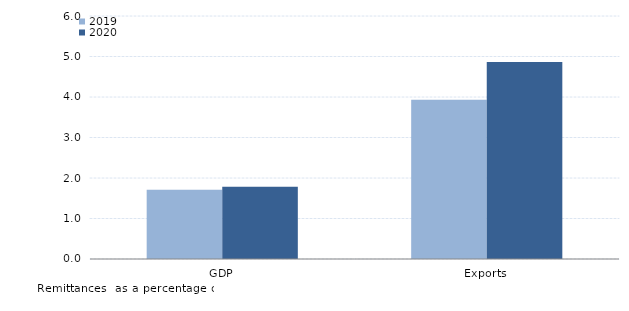
| Category | 2019 | 2020 |
|---|---|---|
| GDP | 1.712 | 1.782 |
| Exports | 3.931 | 4.862 |